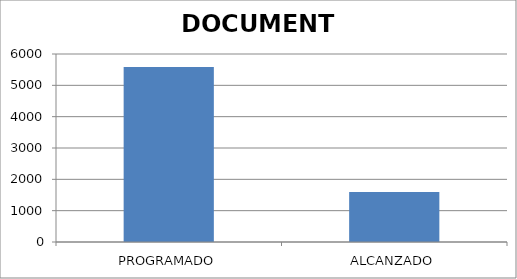
| Category | DOCUMENTO |
|---|---|
| PROGRAMADO | 5585 |
| ALCANZADO | 1595 |